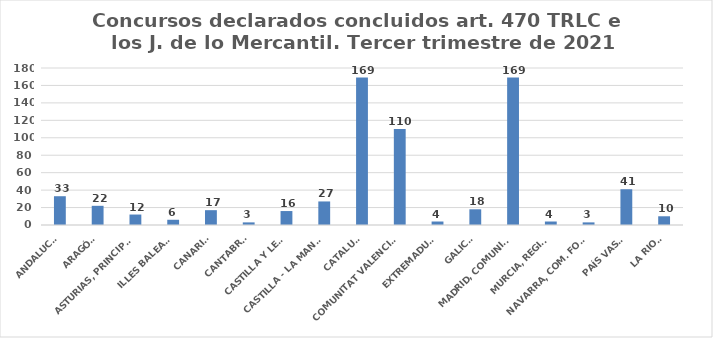
| Category | Series 0 |
|---|---|
| ANDALUCÍA | 33 |
| ARAGÓN | 22 |
| ASTURIAS, PRINCIPADO | 12 |
| ILLES BALEARS | 6 |
| CANARIAS | 17 |
| CANTABRIA | 3 |
| CASTILLA Y LEÓN | 16 |
| CASTILLA - LA MANCHA | 27 |
| CATALUÑA | 169 |
| COMUNITAT VALENCIANA | 110 |
| EXTREMADURA | 4 |
| GALICIA | 18 |
| MADRID, COMUNIDAD | 169 |
| MURCIA, REGIÓN | 4 |
| NAVARRA, COM. FORAL | 3 |
| PAÍS VASCO | 41 |
| LA RIOJA | 10 |